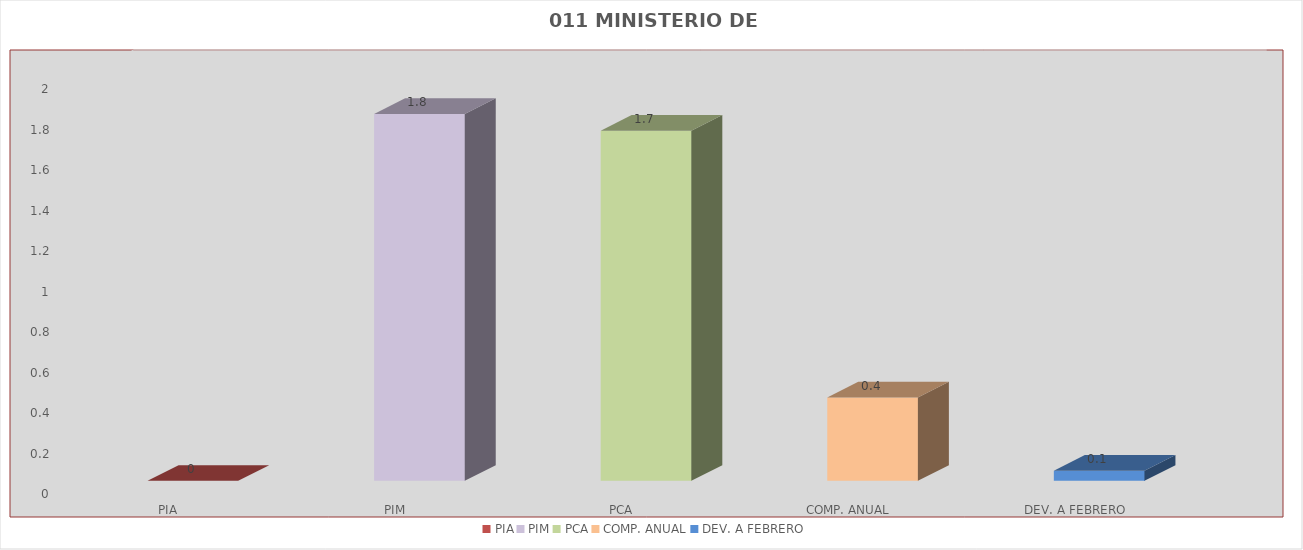
| Category | 011 MINISTERIO DE SALUD |
|---|---|
| PIA | 0 |
| PIM | 1.813 |
| PCA | 1.731 |
| COMP. ANUAL | 0.412 |
| DEV. A FEBRERO | 0.051 |